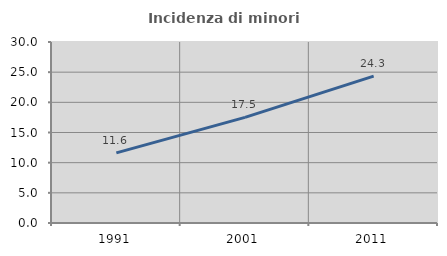
| Category | Incidenza di minori stranieri |
|---|---|
| 1991.0 | 11.628 |
| 2001.0 | 17.5 |
| 2011.0 | 24.335 |